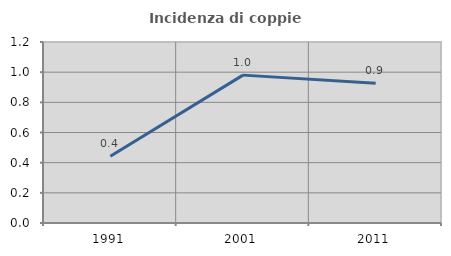
| Category | Incidenza di coppie miste |
|---|---|
| 1991.0 | 0.442 |
| 2001.0 | 0.98 |
| 2011.0 | 0.926 |